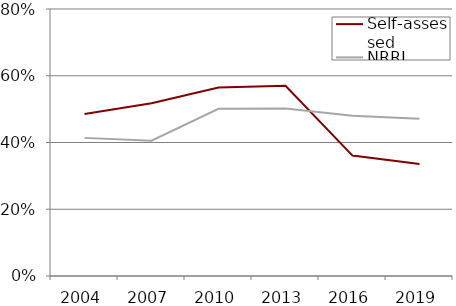
| Category | Self-assessed | NRRI |
|---|---|---|
| 2004.0 | 0.485 | 0.414 |
| 2007.0 | 0.518 | 0.405 |
| 2010.0 | 0.565 | 0.501 |
| 2013.0 | 0.57 | 0.502 |
| 2016.0 | 0.361 | 0.48 |
| 2019.0 | 0.335 | 0.471 |